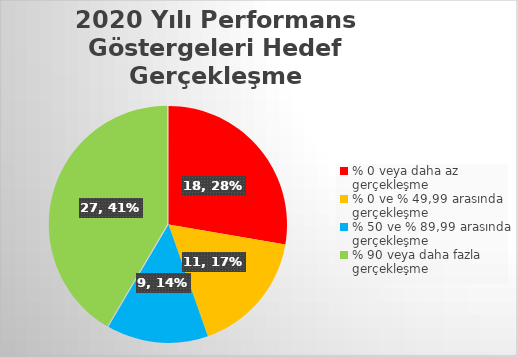
| Category | Series 0 |
|---|---|
| % 0 veya daha az gerçekleşme | 18 |
| % 0 ve % 49,99 arasında  gerçekleşme | 11 |
| % 50 ve % 89,99 arasında  gerçekleşme | 9 |
| % 90 veya daha fazla gerçekleşme | 27 |